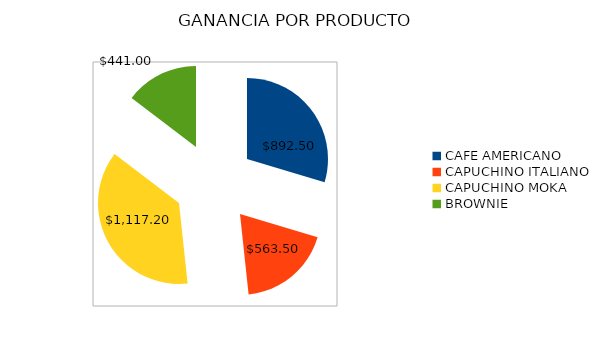
| Category | TOTAL  |
|---|---|
| CAFE AMERICANO | 892.5 |
| CAPUCHINO ITALIANO | 563.5 |
| CAPUCHINO MOKA | 1117.2 |
| BROWNIE | 441 |